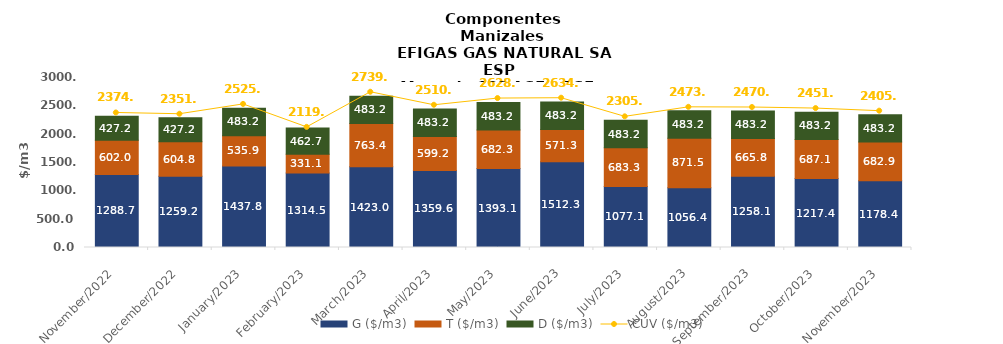
| Category | G ($/m3) | T ($/m3) | D ($/m3) |
|---|---|---|---|
| 2022-11-01 | 1288.68 | 602.02 | 427.16 |
| 2022-12-01 | 1259.19 | 604.8 | 427.16 |
| 2023-01-01 | 1437.76 | 535.94 | 483.2 |
| 2023-02-01 | 1314.49 | 331.09 | 462.69 |
| 2023-03-01 | 1422.95 | 763.36 | 483.205 |
| 2023-04-01 | 1359.57 | 599.24 | 483.2 |
| 2023-05-01 | 1393.1 | 682.25 | 483.2 |
| 2023-06-01 | 1512.34 | 571.34 | 483.2 |
| 2023-07-01 | 1077.14 | 683.33 | 483.2 |
| 2023-08-01 | 1056.36 | 871.51 | 483.2 |
| 2023-09-01 | 1258.12 | 665.75 | 483.2 |
| 2023-10-01 | 1217.367 | 687.084 | 483.205 |
| 2023-11-01 | 1178.421 | 682.88 | 483.205 |